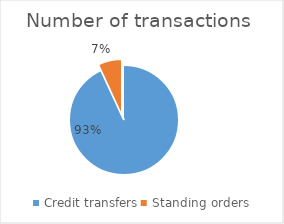
| Category | Number of transactions  |
|---|---|
| Credit transfers | 326255218 |
| Standing orders | 24095970 |